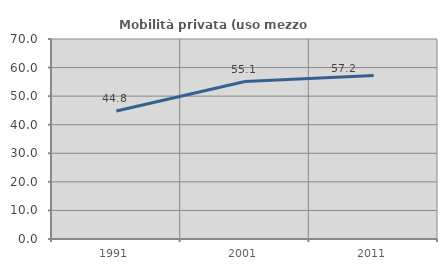
| Category | Mobilità privata (uso mezzo privato) |
|---|---|
| 1991.0 | 44.792 |
| 2001.0 | 55.097 |
| 2011.0 | 57.182 |